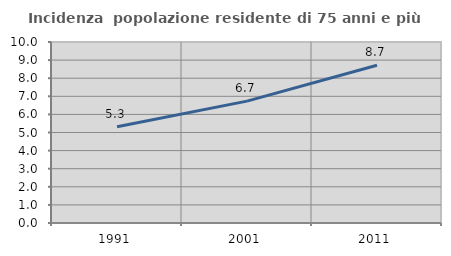
| Category | Incidenza  popolazione residente di 75 anni e più |
|---|---|
| 1991.0 | 5.317 |
| 2001.0 | 6.735 |
| 2011.0 | 8.712 |